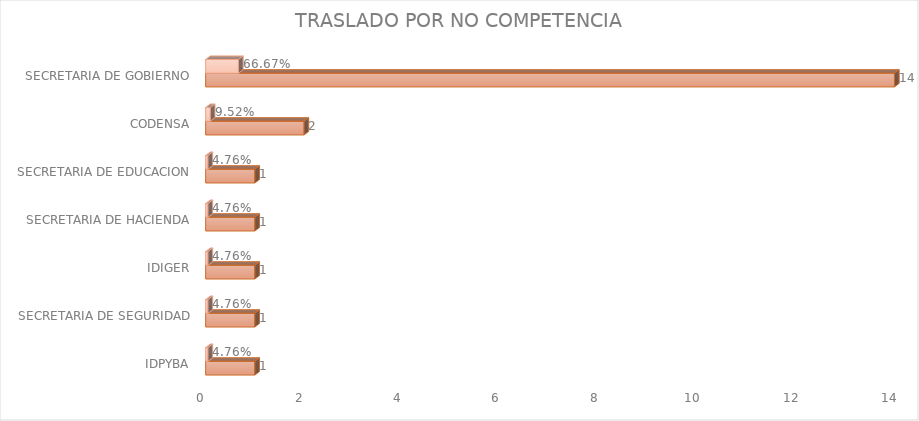
| Category | Cuenta de Número petición | Cuenta de Número petición2 |
|---|---|---|
| IDPYBA | 1 | 0.048 |
| SECRETARIA DE SEGURIDAD | 1 | 0.048 |
| IDIGER | 1 | 0.048 |
| SECRETARIA DE HACIENDA | 1 | 0.048 |
| SECRETARIA DE EDUCACION | 1 | 0.048 |
| CODENSA | 2 | 0.095 |
| SECRETARIA DE GOBIERNO | 14 | 0.667 |